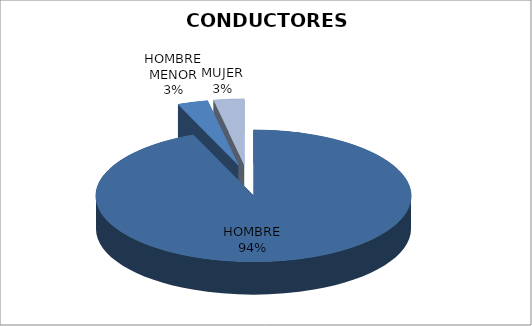
| Category | E.E. |
|---|---|
| HOMBRE | 30 |
| HOMBRE MENOR | 1 |
| MUJER | 1 |